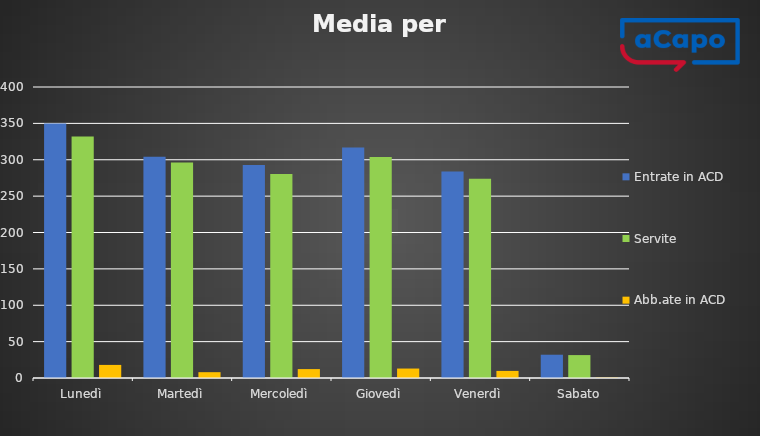
| Category | Entrate in ACD | Servite | Abb.ate in ACD |
|---|---|---|---|
| Lunedì | 350 | 332 | 18 |
| Martedì | 304.25 | 296.25 | 8 |
| Mercoledì | 292.75 | 280.5 | 12.25 |
| Giovedì | 316.75 | 303.75 | 13 |
| Venerdì | 283.75 | 274 | 9.75 |
| Sabato | 32 | 31.5 | 0.5 |